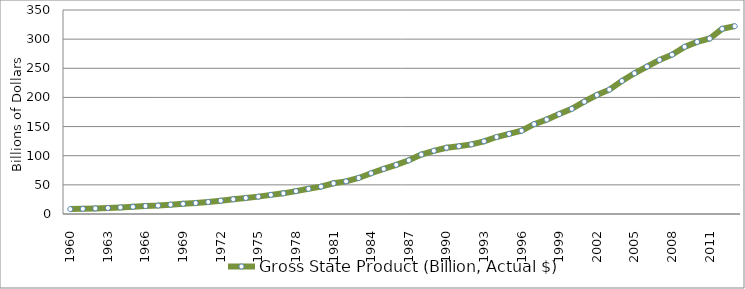
| Category | Gross State Product (Billion, Actual $) |
|---|---|
| 1960.0 | 8.386 |
| 1961.0 | 8.913 |
| 1962.0 | 9.637 |
| 1963.0 | 10.319 |
| 1964.0 | 11.237 |
| 1965.0 | 12.342 |
| 1966.0 | 13.661 |
| 1967.0 | 14.428 |
| 1968.0 | 15.963 |
| 1969.0 | 17.502 |
| 1970.0 | 18.836 |
| 1971.0 | 20.631 |
| 1972.0 | 22.802 |
| 1973.0 | 25.274 |
| 1974.0 | 27.545 |
| 1975.0 | 29.79 |
| 1976.0 | 32.825 |
| 1977.0 | 35.432 |
| 1978.0 | 39.266 |
| 1979.0 | 43.193 |
| 1980.0 | 46.983 |
| 1981.0 | 52.654 |
| 1982.0 | 55.913 |
| 1983.0 | 61.797 |
| 1984.0 | 69.915 |
| 1985.0 | 77.318 |
| 1986.0 | 84.402 |
| 1987.0 | 92.102 |
| 1988.0 | 102.026 |
| 1989.0 | 108.47 |
| 1990.0 | 113.723 |
| 1991.0 | 116.226 |
| 1992.0 | 119.454 |
| 1993.0 | 124.745 |
| 1994.0 | 132.052 |
| 1995.0 | 137.391 |
| 1996.0 | 142.91 |
| 1997.0 | 154.139 |
| 1998.0 | 161.954 |
| 1999.0 | 171.373 |
| 2000.0 | 180.367 |
| 2001.0 | 192.659 |
| 2002.0 | 204.12 |
| 2003.0 | 213.306 |
| 2004.0 | 228.223 |
| 2005.0 | 241.461 |
| 2006.0 | 252.997 |
| 2007.0 | 264.426 |
| 2008.0 | 273.333 |
| 2009.0 | 286.797 |
| 2010.0 | 295.304 |
| 2011.0 | 301.1 |
| 2012.0 | 317.678 |
| 2013.0 | 322.234 |